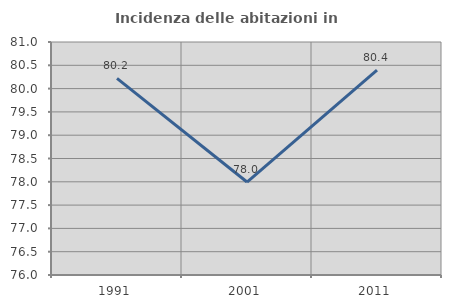
| Category | Incidenza delle abitazioni in proprietà  |
|---|---|
| 1991.0 | 80.219 |
| 2001.0 | 77.995 |
| 2011.0 | 80.397 |